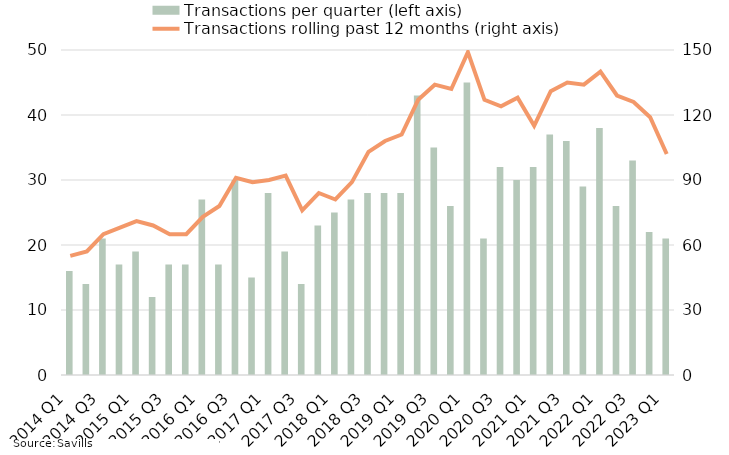
| Category | Transactions per quarter (left axis) |
|---|---|
| 2014 Q1 | 16 |
| 2014 Q2 | 14 |
| 2014 Q3 | 21 |
| 2014 Q4 | 17 |
| 2015 Q1 | 19 |
| 2015 Q2 | 12 |
| 2015 Q3 | 17 |
| 2015 Q4 | 17 |
| 2016 Q1 | 27 |
| 2016 Q2 | 17 |
| 2016 Q3 | 30 |
| 2016 Q4 | 15 |
| 2017 Q1 | 28 |
| 2017 Q2 | 19 |
| 2017 Q3 | 14 |
| 2017 Q4 | 23 |
| 2018 Q1 | 25 |
| 2018 Q2 | 27 |
| 2018 Q3 | 28 |
| 2018 Q4 | 28 |
| 2019 Q1 | 28 |
| 2019 Q2 | 43 |
| 2019 Q3 | 35 |
| 2019 Q4 | 26 |
| 2020 Q1 | 45 |
| 2020 Q2 | 21 |
| 2020 Q3 | 32 |
| 2020 Q4 | 30 |
| 2021 Q1 | 32 |
| 2021 Q2 | 37 |
| 2021 Q3 | 36 |
| 2021 Q4 | 29 |
| 2022 Q1 | 38 |
| 2022 Q2 | 26 |
| 2022 Q3 | 33 |
| 2022 Q4 | 22 |
| 2023 Q1 | 21 |